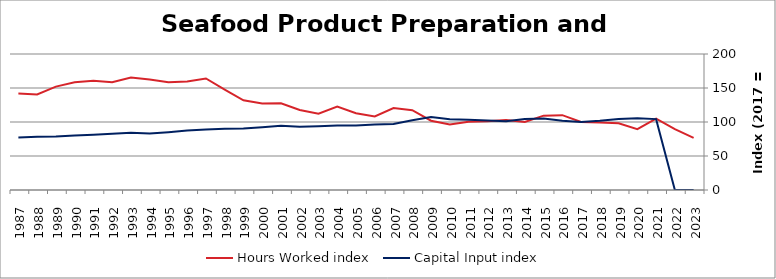
| Category | Hours Worked index | Capital Input index |
|---|---|---|
| 2023.0 | 76.706 | 0 |
| 2022.0 | 89.461 | 0 |
| 2021.0 | 105.079 | 104.231 |
| 2020.0 | 89.461 | 105.515 |
| 2019.0 | 98.101 | 104.51 |
| 2018.0 | 99.191 | 101.731 |
| 2017.0 | 100 | 100 |
| 2016.0 | 110.09 | 101.908 |
| 2015.0 | 109.308 | 105.094 |
| 2014.0 | 99.898 | 104.572 |
| 2013.0 | 103.051 | 100.945 |
| 2012.0 | 101.278 | 102.279 |
| 2011.0 | 100.391 | 103.3 |
| 2010.0 | 96.313 | 103.975 |
| 2009.0 | 101.849 | 107.228 |
| 2008.0 | 117.335 | 102.633 |
| 2007.0 | 120.606 | 97.066 |
| 2006.0 | 108.189 | 96.436 |
| 2005.0 | 112.802 | 95.001 |
| 2004.0 | 122.731 | 94.86 |
| 2003.0 | 112.089 | 93.924 |
| 2002.0 | 117.672 | 92.972 |
| 2001.0 | 127.397 | 94.593 |
| 2000.0 | 127.259 | 92.4 |
| 1999.0 | 131.904 | 90.386 |
| 1998.0 | 147.632 | 89.896 |
| 1997.0 | 164.081 | 89.079 |
| 1996.0 | 159.547 | 87.32 |
| 1995.0 | 158.491 | 85.058 |
| 1994.0 | 162.415 | 83.195 |
| 1993.0 | 165.474 | 84.132 |
| 1992.0 | 158.455 | 82.827 |
| 1991.0 | 160.553 | 81.191 |
| 1990.0 | 158.351 | 80.011 |
| 1989.0 | 152.069 | 78.706 |
| 1988.0 | 140.557 | 78.479 |
| 1987.0 | 141.958 | 77.115 |